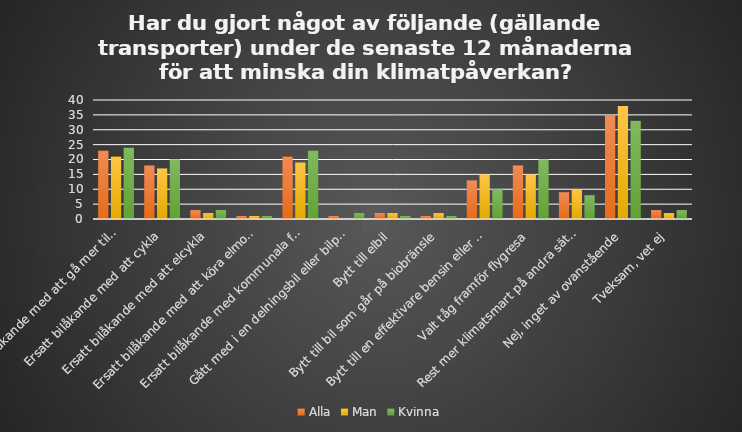
| Category | Alla | Man | Kvinna |
|---|---|---|---|
| Ersatt bilåkande med att gå mer till fots | 23 | 21 | 24 |
| Ersatt bilåkande med att cykla | 18 | 17 | 20 |
| Ersatt bilåkande med att elcykla | 3 | 2 | 3 |
| Ersatt bilåkande med att köra elmoped | 1 | 1 | 1 |
| Ersatt bilåkande med kommunala färdmedel | 21 | 19 | 23 |
| Gått med i en delningsbil eller bilpool | 1 | 0 | 2 |
| Bytt till elbil | 2 | 2 | 1 |
| Bytt till bil som går på biobränsle | 1 | 2 | 1 |
| Bytt till en effektivare bensin eller dieselbil som släpper ut mindre koldioxid | 13 | 15 | 10 |
| Valt tåg framför flygresa | 18 | 15 | 20 |
| Rest mer klimatsmart på andra sätt än ovan nämnda | 9 | 10 | 8 |
| Nej, inget av ovanstående | 35 | 38 | 33 |
| Tveksam, vet ej | 3 | 2 | 3 |